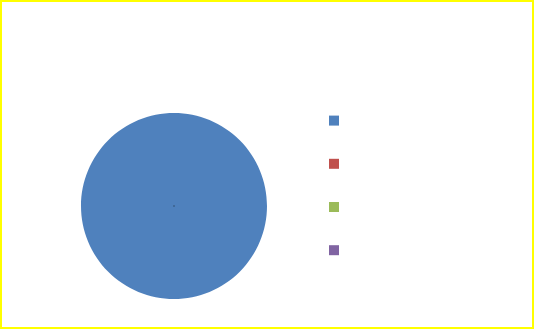
| Category | Series 0 |
|---|---|
| Заняття проведено на високому рівні | 7 |
| Заняття проведено на середньому рівні | 0 |
| Заняття проведено на достатньому рівні | 0 |
| Заняття проведено на низькому рівні | 0 |